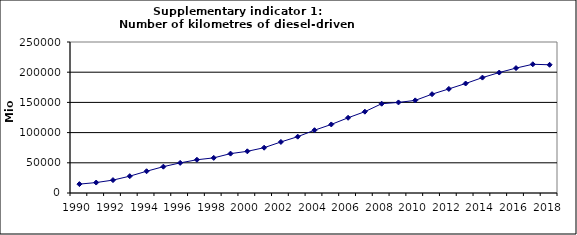
| Category | Number of kilometres of diesel-driven passenger cars, Mio km |
|---|---|
| 1990 | 14717.435 |
| 1991 | 17306.443 |
| 1992 | 21359.321 |
| 1993 | 27866.991 |
| 1994 | 36026.063 |
| 1995 | 43609.619 |
| 1996 | 49869.768 |
| 1997 | 55028.811 |
| 1998 | 58179.786 |
| 1999 | 65198.668 |
| 2000 | 68999.741 |
| 2001 | 75015.534 |
| 2002 | 84524.752 |
| 2003 | 93257.628 |
| 2004 | 103952.55 |
| 2005 | 113495.429 |
| 2006 | 124549.25 |
| 2007 | 134669.603 |
| 2008 | 147824.09 |
| 2009 | 149960.461 |
| 2010 | 153329.822 |
| 2011 | 163601.821 |
| 2012 | 172330.867 |
| 2013 | 181268.443 |
| 2014 | 191061.657 |
| 2015 | 199434.769 |
| 2016 | 206808.63 |
| 2017 | 213142.86 |
| 2018 | 212262.649 |